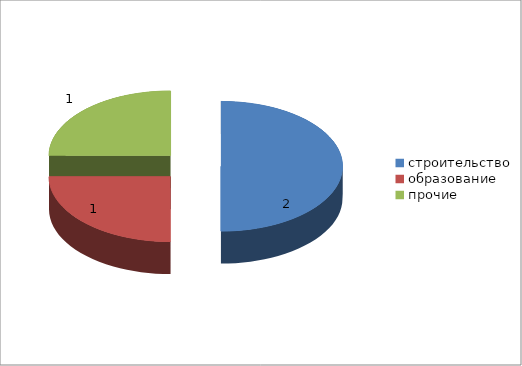
| Category | Series 0 |
|---|---|
| строительство | 2 |
| образование | 1 |
| прочие | 1 |